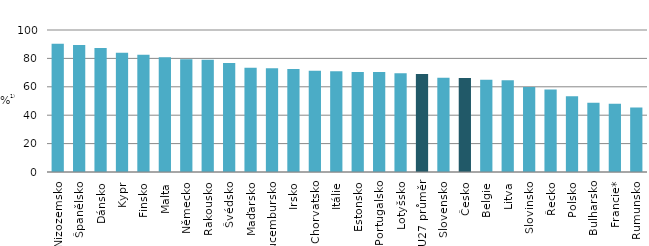
| Category | Series 0 |
|---|---|
| Nizozemsko | 90.25 |
| Španělsko | 89.484 |
| Dánsko | 87.395 |
| Kypr | 83.892 |
| Finsko | 82.609 |
| Malta | 80.888 |
| Německo | 79.48 |
| Rakousko | 79.131 |
| Švédsko | 76.809 |
| Maďarsko | 73.428 |
| Lucembursko | 73.064 |
| Irsko | 72.498 |
| Chorvatsko | 71.377 |
| Itálie | 71.014 |
| Estonsko | 70.486 |
| Portugalsko | 70.342 |
| Lotyšsko | 69.478 |
| EU27 průměr | 69.005 |
| Slovensko | 66.453 |
| Česko | 66.198 |
| Belgie | 65.01 |
| Litva | 64.662 |
| Slovinsko | 59.857 |
| Řecko | 58.07 |
| Polsko | 53.389 |
| Bulharsko | 48.796 |
| Francie* | 48.134 |
| Rumunsko | 45.484 |